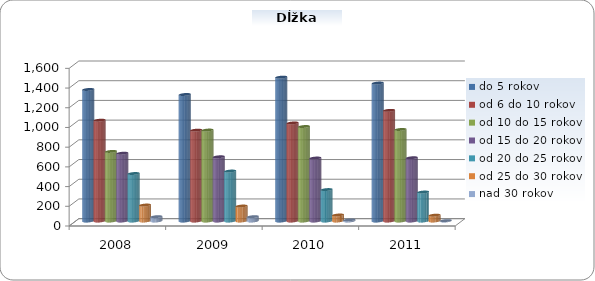
| Category | do 5 rokov | od 6 do 10 rokov | od 10 do 15 rokov | od 15 do 20 rokov | od 20 do 25 rokov | od 25 do 30 rokov | nad 30 rokov |
|---|---|---|---|---|---|---|---|
| 2008.0 | 1335 | 1023 | 706 | 688 | 482 | 162 | 44 |
| 2009.0 | 1284 | 922 | 923 | 652 | 507 | 152 | 44 |
| 2010.0 | 1460 | 995 | 959 | 639 | 319 | 61 | 11 |
| 2011.0 | 1400 | 1123 | 929 | 642 | 294 | 59 | 4 |